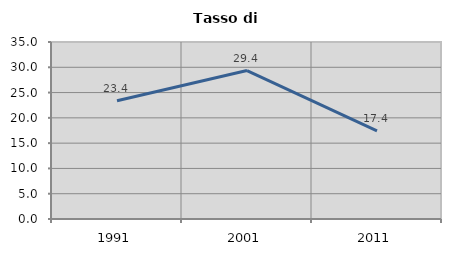
| Category | Tasso di disoccupazione   |
|---|---|
| 1991.0 | 23.367 |
| 2001.0 | 29.355 |
| 2011.0 | 17.442 |